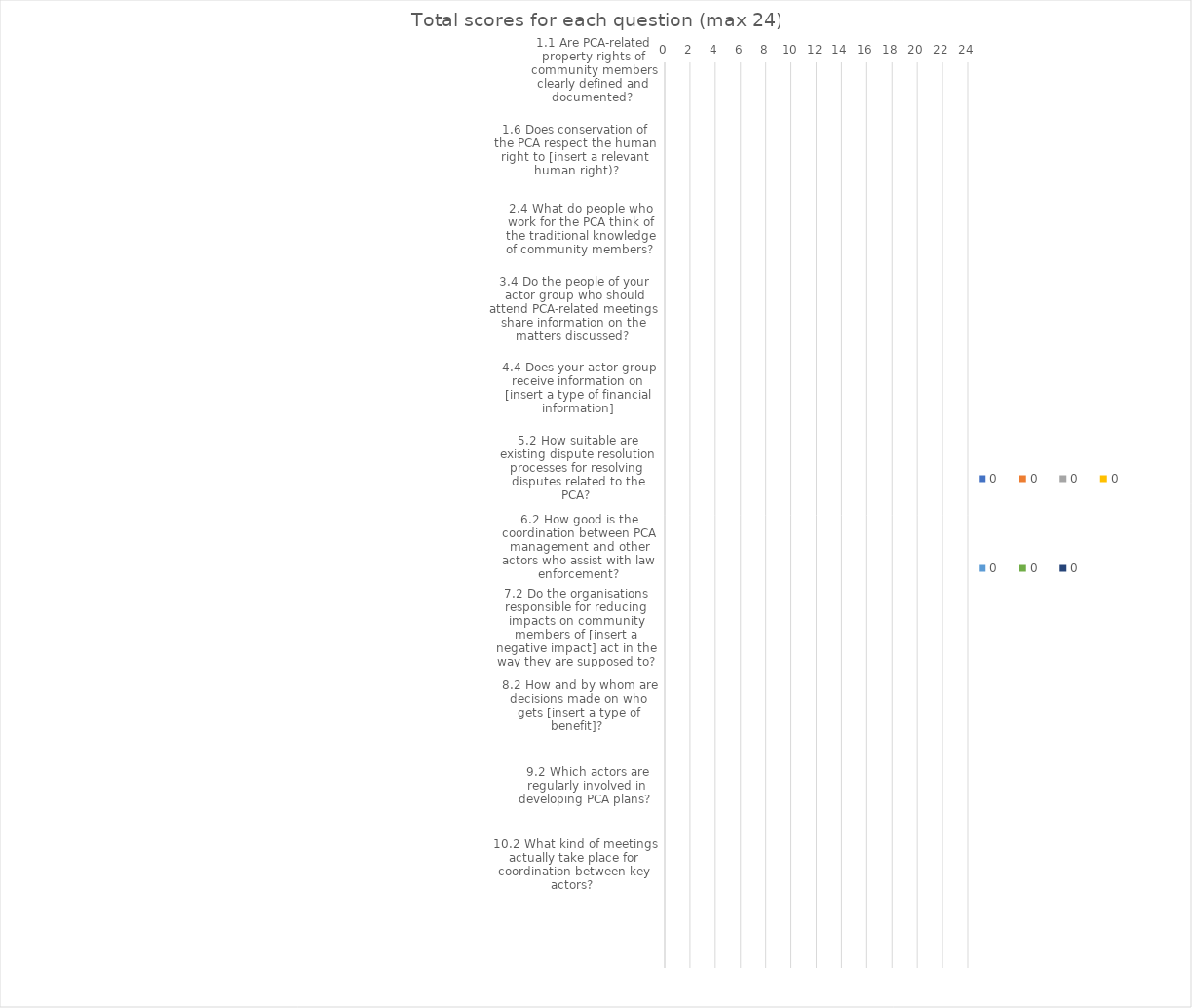
| Category | 0 |
|---|---|
| 1.1 Are PCA-related property rights of community members clearly defined and documented?  | 0 |
| 1.2 What proportion of adults in the community who have a right to [insert a relevant right] are aware of this?  | 0 |
| 1.3 What proportion of adults in the community who have this right can exercise it?  | 0 |
| 1.4 What proportion of adults in the community who have a right to [insert a relevant right] are aware of this?  | 0 |
| 1.5 What proportion of adults in the community who have this right can exercise it?  | 0 |
| 1.6 Does conservation of the PCA respect the human right to [insert a relevant human right)? | 0 |
| 1.7 Does conservation of the PCA respect the human right to [insert a relevant human right)? | 0 |
| 2.1 What kind of stakeholder/actor analysis (SA) has been done?  | 0 |
| 2.2 How do people who work for the PCA regard community members and their interests in the PCA?  | 0 |
| 2.3 How do community members regard people who work for the PCA and the roles that they perform?  | 0 |
| 2.4 What do people who work for the PCA think of the traditional knowledge of community members?  | 0 |
| 2.5 Is there any negative bias against any particular group of actors?  | 0 |
| 3.1 Are the governance structures and processes for decision-making clearly defined and documented? | 0 |
| 3.2 What kind of PCA-related decisions are people of your actor group involved in?  | 0 |
| 3.3 When people of your actor group attend PCA-related meetings, do they have the information they need to contribute? | 0 |
| 3.4 Do the people of your actor group who should attend PCA-related meetings share information on the matters discussed?  | 0 |
| 3.5 How much influence does your actor group have on PCA-related decisions that are important to your actor group?  | 0 |
| 4.1  Are the PCA-related responsibilities of key actors clearly defined and documented? | 0 |
| 4.2 What proportion of adults in the community know the location of PCA boundaries in their area?  | 0 |
| 4.3 If community members know of a threat to the PCA from their community do they report this to [insert name of the relevant authority]?  | 0 |
| 4.4 Does your actor group receive information on [insert a type of financial information] | 0 |
| 4.5 Are funds for conservation of the PCA and related support to communities being properly used? | 0 |
| 4.6 What does your actor group do if seriously concerned about how another actor performs on a key PCA-related responsibility? | 0 |
| 4.7 What happens if someone in your own actor group performs poorly on a key PCA-related responsibility? | 0 |
| 5.1 Are existing dispute resolution processes relevant to the PCA clearly documented?  | 0 |
| 5.2 How suitable are existing dispute resolution processes for resolving disputes related to the PCA?  | 0 |
| 5.3 What proportion of adults in the community are aware of these dispute resolution processes?  | 0 |
| 5.4 What proportion of adults in the community are able to use a dispute resolution process if they want to?  | 0 |
| 5.5 How often do dispute resolution processes succeed in resolving PCA-related disputes?  | 0 |
| 6.1 Are PCA-related laws and regulations clearly defined and documented?  | 0 |
| 6.2 How good is the coordination between PCA management and other actors who assist with law enforcement? | 0 |
| 6.3 Are incidents of law-breaking dealt with according to the law and are similar cases treated in the same way?  | 0 |
| 6.4 How is the conduct of people responsible for enforcing PCA laws when interacting with community members?  | 0 |
| 6.5 How effective are law enforcement activities in reducing law-breaking?  | 0 |
| 7.1 Have there been any recent studies of the negative impacts of the PCA and its conservation on the wellbeing of community members? | 0 |
| 7.2 Do the organisations responsible for reducing impacts on community members of [insert a negative impact] act in the way they are supposed to? | 0 |
| 7.3 How successful are their actions in reducing the impacts on community members of [insert a negative impact]?  | 0 |
| 7.4 Do the organisations responsible for reducing impacts on community members of [insert negative impact] act in the way they are supposed to? | 0 |
| 7.5 How successful are their actions in reducing the impacts on community members of [insert negative impact]?  | 0 |
| 8.1 Have there been any recent studies of the positive impacts of the PCA and its conservation on the wellbeing of community members? | 0 |
| 8.2 How and by whom are decisions made on who gets [insert a type of benefit]?  | 0 |
| 8.3 Is [insert a type of benefit] provided to communities in line with the decision(s)? | 0 |
| 8.4 How and by whom are decisions made on who gets [insert a type of benefit]?  | 0 |
| 8.5 Is [insert a type of benefit] provided to communities in line with the decision(s)?   | 0 |
| 9.1 Which actors have their PCA-related activities included in the PCA management plan?  | 0 |
| 9.2 Which actors are regularly involved in developing PCA plans?  | 0 |
| 9.3 Does the existing PCA management plan make use of any local and traditional knowledge?  | 0 |
| 9.4 Have there been changes in PCA management activities in response to learning?  | 0 |
| 9.5 Is the objective of [insert an important conservation objective] being achieved?  | 0 |
| 10.1 Are the structures and processes for coordination between actors clearly defined and documented?  | 0 |
| 10.2 What kind of meetings actually take place for coordination between key actors?  | 0 |
| 10.3 How good is information sharing between organisations of key actors at site level?  | 0 |
| 10.4 How good is the coordination of activities between the organisations of key actors at site level?  | 0 |
| 10.5 How good is the alignment of policies and plans between organisations of key actors at lower and higher levels?  | 0 |